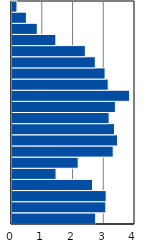
| Category | Series 0 |
|---|---|
| 0-4 | 2.721 |
| 5-9 | 3.051 |
| 10-14 | 3.063 |
| 15-19 | 2.619 |
| 20-24 | 1.433 |
| 25-29 | 2.152 |
| 30-34 | 3.291 |
| 35-39 | 3.435 |
| 40-44 | 3.333 |
| 45-49 | 3.159 |
| 50-54 | 3.363 |
| 55-59 | 3.824 |
| 60-64 | 3.129 |
| 65-69 | 3.027 |
| 70-74 | 2.709 |
| 75-79 | 2.386 |
| 80-84 | 1.427 |
| 85-89 | 0.821 |
| 90-94 | 0.468 |
| 95+ | 0.162 |